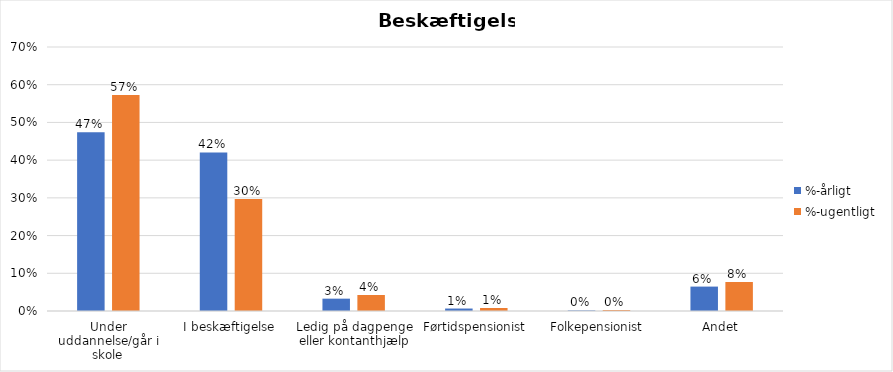
| Category | %-årligt | %-ugentligt |
|---|---|---|
| Under uddannelse/går i skole | 0.474 | 0.573 |
| I beskæftigelse | 0.42 | 0.297 |
| Ledig på dagpenge eller kontanthjælp | 0.033 | 0.042 |
| Førtidspensionist | 0.007 | 0.008 |
| Folkepensionist | 0.001 | 0.003 |
| Andet | 0.065 | 0.077 |